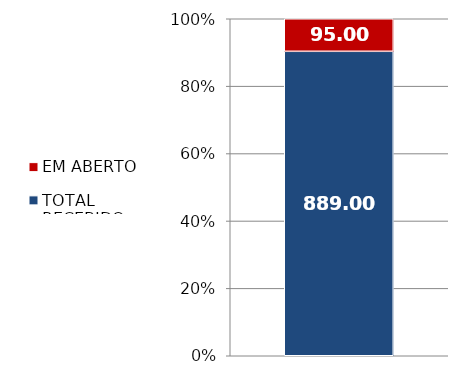
| Category | TOTAL RECEBIDO | EM ABERTO |
|---|---|---|
| 0 | 889 | 95 |